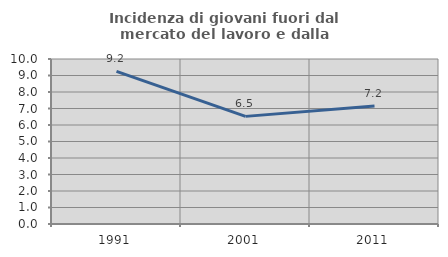
| Category | Incidenza di giovani fuori dal mercato del lavoro e dalla formazione  |
|---|---|
| 1991.0 | 9.245 |
| 2001.0 | 6.523 |
| 2011.0 | 7.155 |